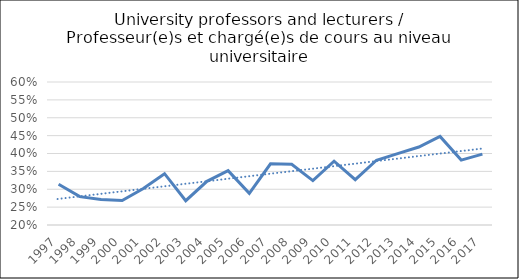
| Category | Series 0 |
|---|---|
| 1997.0 | 0.314 |
| 1998.0 | 0.279 |
| 1999.0 | 0.271 |
| 2000.0 | 0.269 |
| 2001.0 | 0.302 |
| 2002.0 | 0.344 |
| 2003.0 | 0.268 |
| 2004.0 | 0.322 |
| 2005.0 | 0.352 |
| 2006.0 | 0.289 |
| 2007.0 | 0.371 |
| 2008.0 | 0.37 |
| 2009.0 | 0.324 |
| 2010.0 | 0.378 |
| 2011.0 | 0.327 |
| 2012.0 | 0.381 |
| 2013.0 | 0.399 |
| 2014.0 | 0.418 |
| 2015.0 | 0.448 |
| 2016.0 | 0.382 |
| 2017.0 | 0.398 |